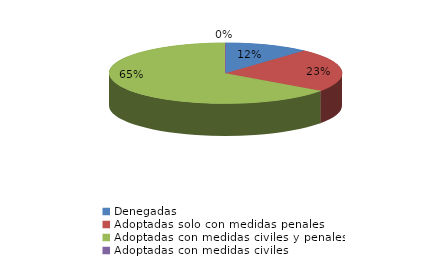
| Category | Series 0 |
|---|---|
| Denegadas | 109 |
| Adoptadas solo con medidas penales | 216 |
| Adoptadas con medidas civiles y penales | 607 |
| Adoptadas con medidas civiles | 0 |